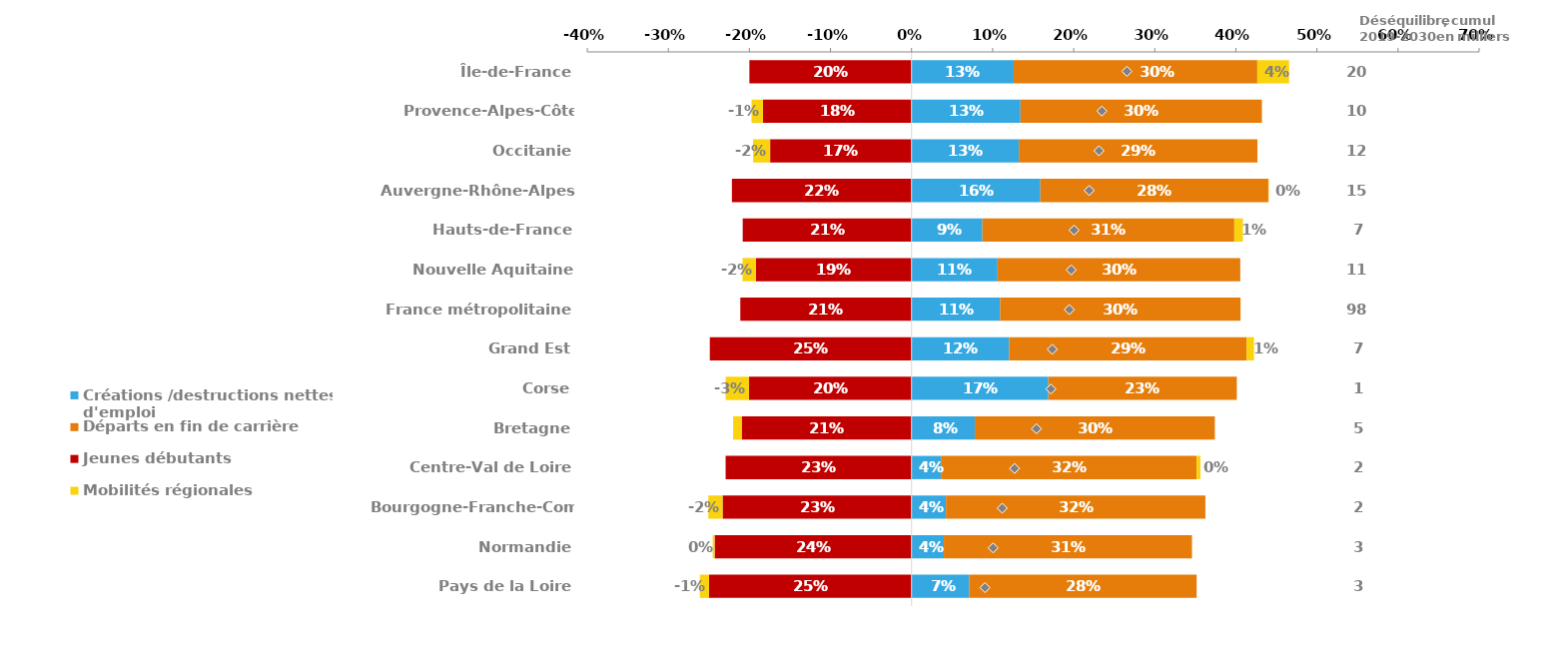
| Category | Créations /destructions nettes d'emploi | Départs en fin de carrière | Jeunes débutants | Mobilités régionales | Position étiquette Déséquilibre en eff |
|---|---|---|---|---|---|
| Île-de-France | 0.126 | 0.3 | -0.2 | 0.039 | 0.1 |
| Provence-Alpes-Côte d'Azur | 0.134 | 0.298 | -0.183 | -0.014 | 0.133 |
| Occitanie | 0.132 | 0.294 | -0.174 | -0.021 | 0.139 |
| Auvergne-Rhône-Alpes | 0.159 | 0.281 | -0.222 | 0.001 | 0.125 |
| Hauts-de-France | 0.087 | 0.311 | -0.208 | 0.011 | 0.157 |
| Nouvelle Aquitaine | 0.106 | 0.299 | -0.192 | -0.017 | 0.16 |
| France métropolitaine | 0.109 | 0.297 | -0.211 | 0 | 0.16 |
| Grand Est | 0.12 | 0.293 | -0.249 | 0.009 | 0.143 |
| Corse | 0.169 | 0.233 | -0.2 | -0.029 | 0.164 |
| Bretagne | 0.078 | 0.296 | -0.21 | -0.01 | 0.192 |
| Centre-Val de Loire | 0.036 | 0.315 | -0.229 | 0.005 | 0.209 |
| Bourgogne-Franche-Comté | 0.042 | 0.32 | -0.233 | -0.018 | 0.203 |
| Normandie | 0.04 | 0.306 | -0.243 | -0.002 | 0.22 |
| Pays de la Loire | 0.071 | 0.28 | -0.25 | -0.011 | 0.214 |